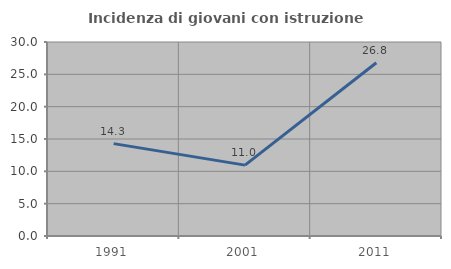
| Category | Incidenza di giovani con istruzione universitaria |
|---|---|
| 1991.0 | 14.286 |
| 2001.0 | 10.959 |
| 2011.0 | 26.786 |